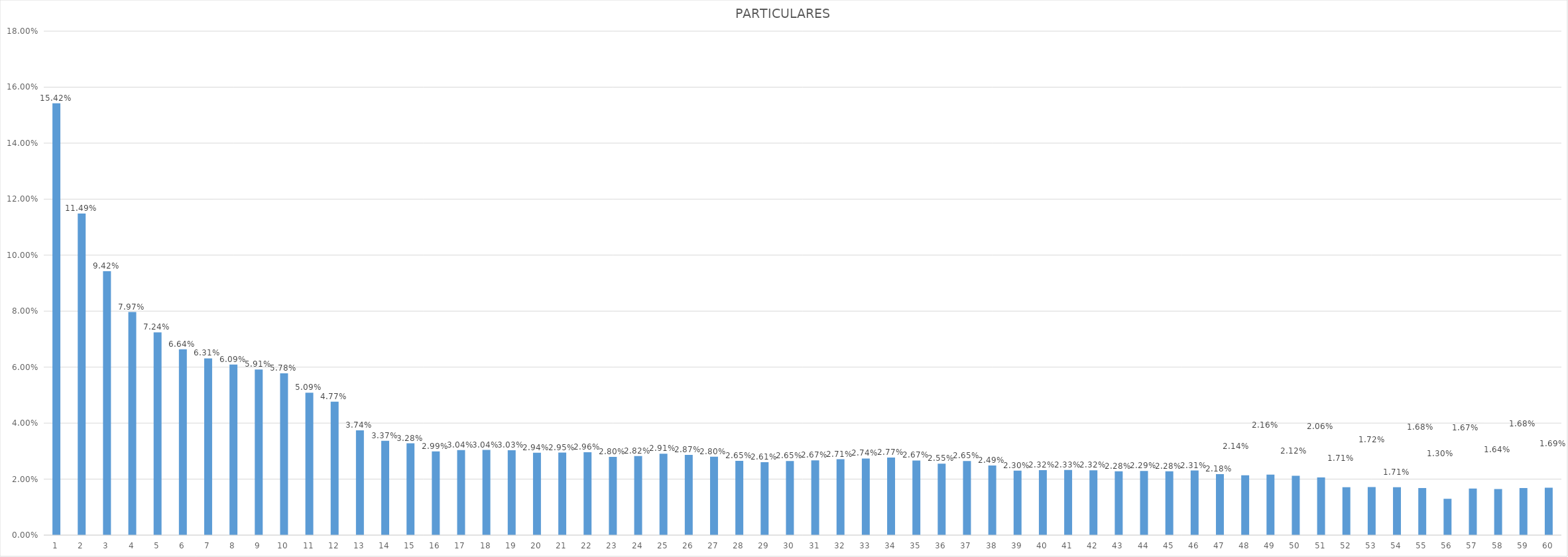
| Category | Series 0 |
|---|---|
| 0 | 0.154 |
| 1 | 0.115 |
| 2 | 0.094 |
| 3 | 0.08 |
| 4 | 0.072 |
| 5 | 0.066 |
| 6 | 0.063 |
| 7 | 0.061 |
| 8 | 0.059 |
| 9 | 0.058 |
| 10 | 0.051 |
| 11 | 0.048 |
| 12 | 0.037 |
| 13 | 0.034 |
| 14 | 0.033 |
| 15 | 0.03 |
| 16 | 0.03 |
| 17 | 0.03 |
| 18 | 0.03 |
| 19 | 0.029 |
| 20 | 0.029 |
| 21 | 0.03 |
| 22 | 0.028 |
| 23 | 0.028 |
| 24 | 0.029 |
| 25 | 0.029 |
| 26 | 0.028 |
| 27 | 0.027 |
| 28 | 0.026 |
| 29 | 0.026 |
| 30 | 0.027 |
| 31 | 0.027 |
| 32 | 0.027 |
| 33 | 0.028 |
| 34 | 0.027 |
| 35 | 0.026 |
| 36 | 0.026 |
| 37 | 0.025 |
| 38 | 0.023 |
| 39 | 0.023 |
| 40 | 0.023 |
| 41 | 0.023 |
| 42 | 0.023 |
| 43 | 0.023 |
| 44 | 0.023 |
| 45 | 0.023 |
| 46 | 0.022 |
| 47 | 0.021 |
| 48 | 0.022 |
| 49 | 0.021 |
| 50 | 0.021 |
| 51 | 0.017 |
| 52 | 0.017 |
| 53 | 0.017 |
| 54 | 0.017 |
| 55 | 0.013 |
| 56 | 0.017 |
| 57 | 0.016 |
| 58 | 0.017 |
| 59 | 0.017 |